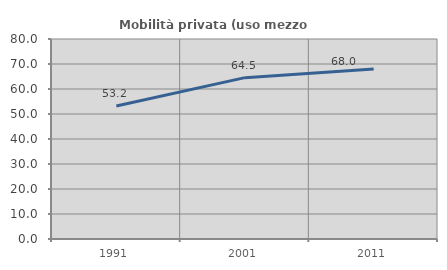
| Category | Mobilità privata (uso mezzo privato) |
|---|---|
| 1991.0 | 53.232 |
| 2001.0 | 64.538 |
| 2011.0 | 68.045 |